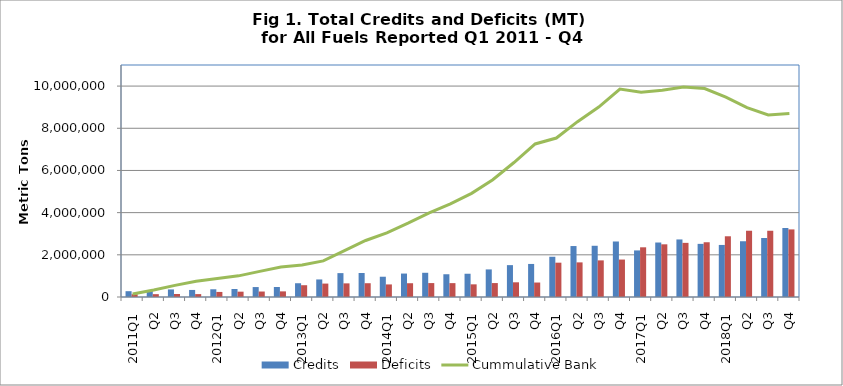
| Category | Credits | Deficits |
|---|---|---|
| 2011Q1 | 275639 | 132283 |
| Q2 | 325071 | 134760 |
| Q3 | 358817 | 141381 |
| Q4 | 334451 | 137396 |
| 2012Q1 | 366391 | 240260 |
| Q2 | 380783 | 252750 |
| Q3 | 471290 | 259582 |
| Q4 | 473045 | 266666 |
| 2013Q1 | 652535 | 558804 |
| Q2 | 832203 | 636140 |
| Q3 | 1132158 | 646613 |
| Q4 | 1137345 | 653565 |
| 2014Q1 | 961291 | 596240 |
| Q2 | 1111634 | 653122 |
| Q3 | 1148264 | 660254 |
| Q4 | 1079152 | 657732 |
| 2015Q1 | 1102964 | 600144 |
| Q2 | 1307728 | 660642 |
| Q3 | 1510776 | 696772 |
| Q4 | 1566956 | 686210 |
| 2016Q1 | 1907968 | 1627210 |
| Q2 | 2416181 | 1641557 |
| Q3 | 2428897 | 1736480 |
| Q4 | 2631988 | 1775489 |
| 2017Q1 | 2208447 | 2356219 |
| Q2 | 2583385 | 2497783 |
| Q3 | 2728710 | 2566731 |
| Q4 | 2519220 | 2595941 |
| 2018Q1 | 2468290 | 2879229 |
| Q2 | 2643813 | 3141737 |
| Q3 | 2798787 | 3140867 |
| Q4 | 3271479 | 3204664 |